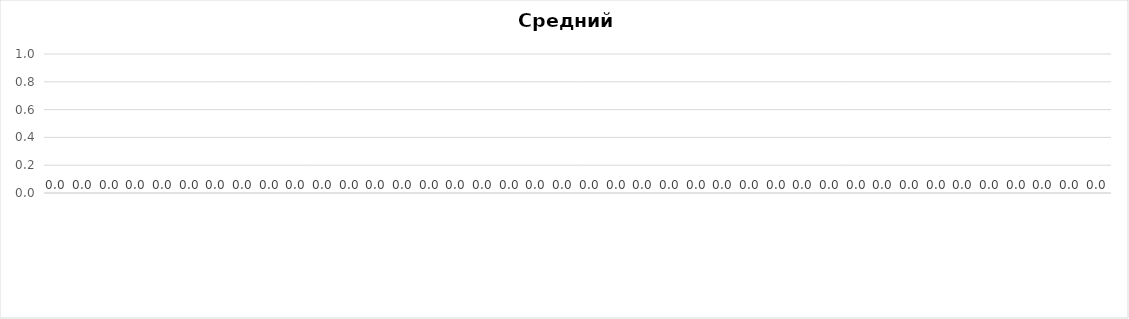
| Category | Средний балл |
|---|---|
|   | 0 |
|   | 0 |
|   | 0 |
|   | 0 |
|   | 0 |
|   | 0 |
|   | 0 |
|   | 0 |
|   | 0 |
|   | 0 |
|   | 0 |
|   | 0 |
|   | 0 |
|   | 0 |
|   | 0 |
|   | 0 |
|   | 0 |
|   | 0 |
|   | 0 |
|   | 0 |
|   | 0 |
|   | 0 |
|   | 0 |
|   | 0 |
|   | 0 |
|   | 0 |
|   | 0 |
|   | 0 |
|   | 0 |
|   | 0 |
|   | 0 |
|   | 0 |
|   | 0 |
|   | 0 |
|   | 0 |
|   | 0 |
|   | 0 |
|   | 0 |
|   | 0 |
|   | 0 |